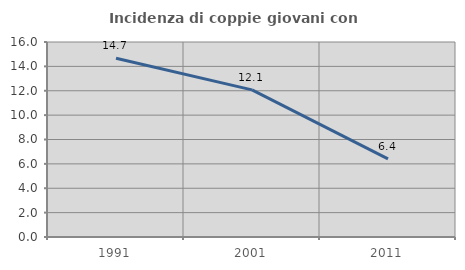
| Category | Incidenza di coppie giovani con figli |
|---|---|
| 1991.0 | 14.67 |
| 2001.0 | 12.073 |
| 2011.0 | 6.416 |